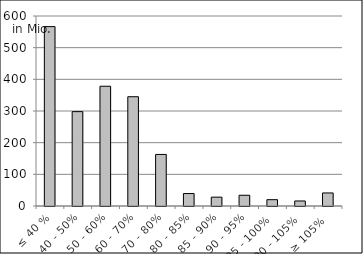
| Category | Volumen |
|---|---|
| ≤ 40 % | 566467823.311 |
| 40 - 50% | 298005642.366 |
| 50 - 60% | 378171071.928 |
| 60 - 70% | 345077546.841 |
| 70 - 80% | 162820319.398 |
| 80 - 85% | 39367989.601 |
| 85 - 90% | 27952818.148 |
| 90 - 95% | 33938577.754 |
| 95 - 100% | 19977972.83 |
| 100 - 105% | 15882149.644 |
| ≥ 105% | 41201486.183 |